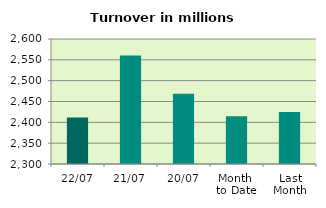
| Category | Series 0 |
|---|---|
| 22/07 | 2411.673 |
| 21/07 | 2560.488 |
| 20/07 | 2468.382 |
| Month 
to Date | 2414.437 |
| Last
Month | 2424.747 |